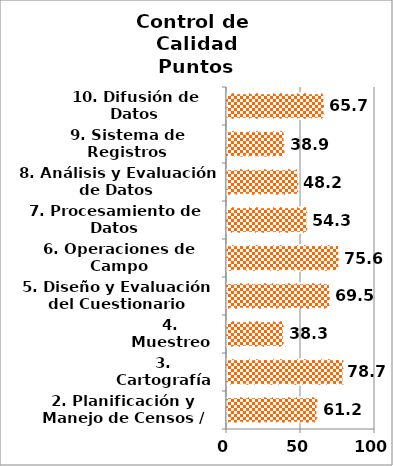
| Category | Series 0 |
|---|---|
| 2. Planificación y Manejo de Censos / Encuestas | 61.181 |
| 3. Cartografía | 78.704 |
| 4. Muestreo | 38.333 |
| 5. Diseño y Evaluación del Cuestionario | 69.546 |
| 6. Operaciones de Campo | 75.595 |
| 7. Procesamiento de Datos | 54.259 |
| 8. Análisis y Evaluación de Datos | 48.205 |
| 9. Sistema de Registros Administrativos | 38.889 |
| 10. Difusión de Datos | 65.7 |